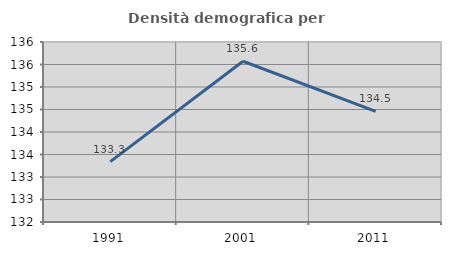
| Category | Densità demografica |
|---|---|
| 1991.0 | 133.341 |
| 2001.0 | 135.572 |
| 2011.0 | 134.457 |